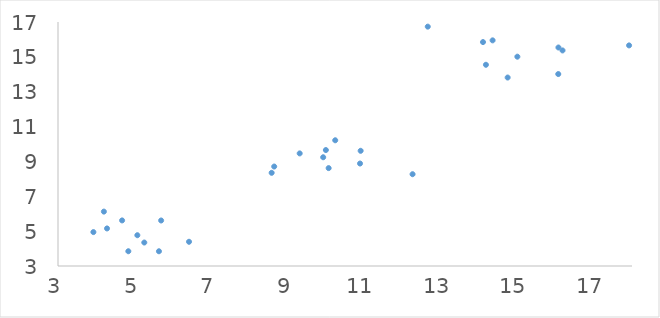
| Category | x2 |
|---|---|
| 3.9248611805141 | 4.946 |
| 6.42376877163096 | 4.39 |
| 4.83796085492435 | 3.847 |
| 5.07355911634957 | 4.766 |
| 5.63797611110035 | 3.845 |
| 4.67504652724002 | 5.616 |
| 4.28086346319376 | 5.155 |
| 4.19892010402685 | 6.121 |
| 5.69496958253675 | 5.611 |
| 5.25501886700086 | 4.347 |
| 8.58352427016797 | 8.347 |
| 9.99998642193724 | 9.653 |
| 10.8927732469235 | 8.88 |
| 10.0725268482187 | 8.617 |
| 12.2655923464648 | 8.267 |
| 10.9091088242579 | 9.609 |
| 10.24436797435 | 10.214 |
| 9.31576173279291 | 9.461 |
| 8.6500808950801 | 8.707 |
| 9.92981588819431 | 9.24 |
| 15.0041930177097 | 15.01 |
| 16.0732827372838 | 14.013 |
| 12.6630188617726 | 16.734 |
| 14.1828605787434 | 14.545 |
| 14.1062423910143 | 15.848 |
| 17.923493976907 | 15.657 |
| 14.3573656419541 | 15.947 |
| 16.077365564055 | 15.537 |
| 16.1844913047207 | 15.369 |
| 14.7505215792486 | 13.814 |